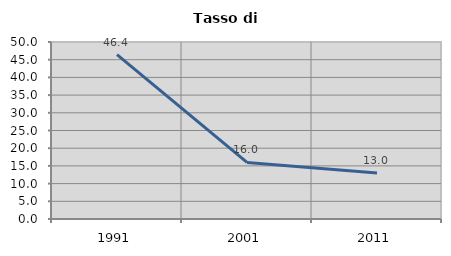
| Category | Tasso di disoccupazione   |
|---|---|
| 1991.0 | 46.446 |
| 2001.0 | 15.972 |
| 2011.0 | 12.967 |